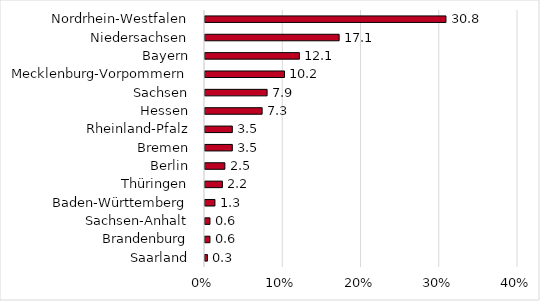
| Category | Series 0 |
|---|---|
| Saarland | 0.317 |
| Brandenburg | 0.635 |
| Sachsen-Anhalt | 0.635 |
| Baden-Württemberg | 1.27 |
| Thüringen | 2.222 |
| Berlin | 2.54 |
| Bremen | 3.492 |
| Rheinland-Pfalz | 3.492 |
| Hessen | 7.302 |
| Sachsen | 7.937 |
| Mecklenburg-Vorpommern | 10.159 |
| Bayern | 12.063 |
| Niedersachsen | 17.143 |
| Nordrhein-Westfalen | 30.794 |